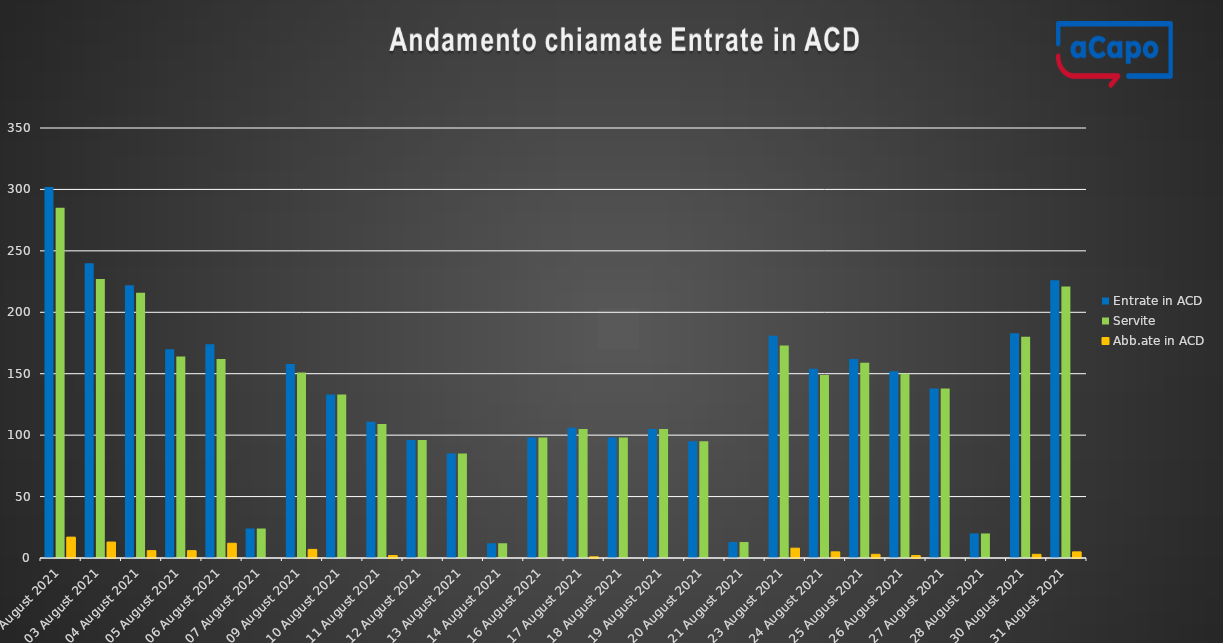
| Category | Entrate in ACD | Servite | Abb.ate in ACD |
|---|---|---|---|
| 2021-08-02 | 302 | 285 | 17 |
| 2021-08-03 | 240 | 227 | 13 |
| 2021-08-04 | 222 | 216 | 6 |
| 2021-08-05 | 170 | 164 | 6 |
| 2021-08-06 | 174 | 162 | 12 |
| 2021-08-07 | 24 | 24 | 0 |
| 2021-08-09 | 158 | 151 | 7 |
| 2021-08-10 | 133 | 133 | 0 |
| 2021-08-11 | 111 | 109 | 2 |
| 2021-08-12 | 96 | 96 | 0 |
| 2021-08-13 | 85 | 85 | 0 |
| 2021-08-14 | 12 | 12 | 0 |
| 2021-08-16 | 98 | 98 | 0 |
| 2021-08-17 | 106 | 105 | 1 |
| 2021-08-18 | 98 | 98 | 0 |
| 2021-08-19 | 105 | 105 | 0 |
| 2021-08-20 | 95 | 95 | 0 |
| 2021-08-21 | 13 | 13 | 0 |
| 2021-08-23 | 181 | 173 | 8 |
| 2021-08-24 | 154 | 149 | 5 |
| 2021-08-25 | 162 | 159 | 3 |
| 2021-08-26 | 152 | 150 | 2 |
| 2021-08-27 | 138 | 138 | 0 |
| 2021-08-28 | 20 | 20 | 0 |
| 2021-08-30 | 183 | 180 | 3 |
| 2021-08-31 | 226 | 221 | 5 |